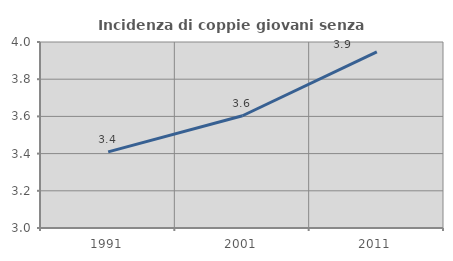
| Category | Incidenza di coppie giovani senza figli |
|---|---|
| 1991.0 | 3.409 |
| 2001.0 | 3.604 |
| 2011.0 | 3.947 |